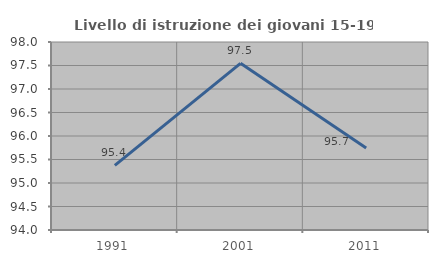
| Category | Livello di istruzione dei giovani 15-19 anni |
|---|---|
| 1991.0 | 95.376 |
| 2001.0 | 97.546 |
| 2011.0 | 95.745 |